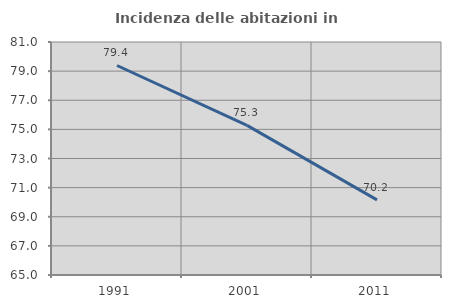
| Category | Incidenza delle abitazioni in proprietà  |
|---|---|
| 1991.0 | 79.387 |
| 2001.0 | 75.274 |
| 2011.0 | 70.162 |